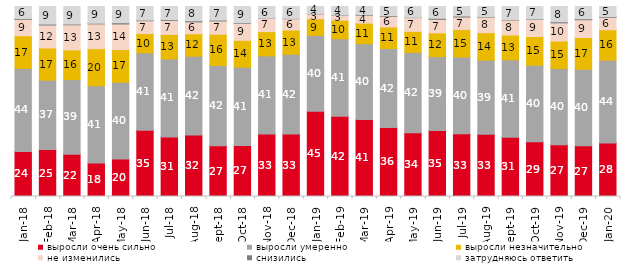
| Category | выросли очень сильно | выросли умеренно | выросли незначительно | не изменились | снизились | затрудняюсь ответить |
|---|---|---|---|---|---|---|
| 2018-01-01 | 23.75 | 43.7 | 17.15 | 8.65 | 0.45 | 6.3 |
| 2018-02-01 | 24.7 | 36.55 | 16.9 | 12.1 | 0.5 | 9.25 |
| 2018-03-01 | 22.25 | 39.3 | 15.6 | 13.2 | 0.4 | 9.25 |
| 2018-04-01 | 17.65 | 40.65 | 19.55 | 13 | 0.35 | 8.8 |
| 2018-05-01 | 19.75 | 40.4 | 17.15 | 13.5 | 0.65 | 8.55 |
| 2018-06-01 | 34.85 | 40.8 | 10.15 | 6.7 | 0.35 | 7.15 |
| 2018-07-01 | 31.3 | 41.05 | 12.9 | 7.4 | 0.45 | 6.85 |
| 2018-08-01 | 32.35 | 41.5 | 11.8 | 6.25 | 0.6 | 7.5 |
| 2018-09-01 | 26.7 | 42.3 | 16.4 | 7 | 0.45 | 7.15 |
| 2018-10-01 | 26.9 | 41.15 | 14.15 | 8.9 | 0.35 | 8.55 |
| 2018-11-01 | 32.934 | 41.068 | 12.774 | 7.036 | 0.1 | 6.088 |
| 2018-12-01 | 32.85 | 42 | 12.75 | 5.95 | 0.2 | 6.25 |
| 2019-01-01 | 44.85 | 39.95 | 8.75 | 2.6 | 0.2 | 3.65 |
| 2019-02-01 | 42.2 | 40.85 | 9.75 | 2.7 | 0.1 | 4.4 |
| 2019-03-01 | 40.527 | 39.881 | 10.84 | 4.177 | 0.348 | 4.227 |
| 2019-04-01 | 36.337 | 41.535 | 11.337 | 5.594 | 0.396 | 4.802 |
| 2019-05-01 | 33.531 | 42.298 | 11.095 | 7.231 | 0.149 | 5.696 |
| 2019-06-01 | 34.763 | 38.853 | 12.469 | 7.132 | 0.599 | 6.185 |
| 2019-07-01 | 32.97 | 40.446 | 14.505 | 6.535 | 0.545 | 5 |
| 2019-08-01 | 32.767 | 39.011 | 14.436 | 8.192 | 0.25 | 5.345 |
| 2019-09-01 | 31.188 | 40.743 | 13.069 | 7.871 | 0.248 | 6.881 |
| 2019-10-01 | 28.762 | 40.347 | 15.099 | 8.96 | 0.248 | 6.584 |
| 2019-11-01 | 27.178 | 40.149 | 14.505 | 9.554 | 0.594 | 8.02 |
| 2019-12-01 | 26.683 | 40.297 | 16.683 | 9.356 | 0.545 | 6.436 |
| 2020-01-01 | 28.218 | 43.515 | 16.04 | 6.436 | 0.396 | 5.396 |